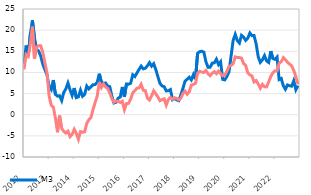
| Category | M3  | Domestic loans to the non-monetary sector |
|---|---|---|
| 2012-01-01 | 12.01 | 10.729 |
| 2012-02-01 | 16.354 | 14.221 |
| 2012-03-01 | 13.992 | 13.782 |
| 2012-04-01 | 18.952 | 16.69 |
| 2012-05-01 | 22.329 | 20.823 |
| 2012-06-01 | 18.134 | 13.296 |
| 2012-07-01 | 15.507 | 16.043 |
| 2012-08-01 | 15.015 | 16.313 |
| 2012-09-01 | 13.837 | 16.292 |
| 2012-10-01 | 11.912 | 14.641 |
| 2012-11-01 | 10.629 | 12.241 |
| 2012-12-01 | 9.421 | 9.834 |
| 2013-01-01 | 6.554 | 4.448 |
| 2013-02-01 | 5.916 | 2.211 |
| 2013-03-01 | 8.196 | 1.791 |
| 2013-04-01 | 4.809 | -0.816 |
| 2013-05-01 | 4.39 | -4.149 |
| 2013-06-01 | 4.482 | -0.203 |
| 2013-07-01 | 3.358 | -3.232 |
| 2013-08-01 | 5.277 | -3.913 |
| 2013-09-01 | 6.108 | -4.338 |
| 2013-10-01 | 7.502 | -3.897 |
| 2013-11-01 | 5.896 | -5.181 |
| 2013-12-01 | 4.573 | -4.65 |
| 2014-01-01 | 6.313 | -3.453 |
| 2014-02-01 | 4.038 | -4.43 |
| 2014-03-01 | 4.234 | -5.804 |
| 2014-04-01 | 5.797 | -3.993 |
| 2014-05-01 | 4.358 | -4.149 |
| 2014-06-01 | 4.845 | -4.035 |
| 2014-07-01 | 6.767 | -2.016 |
| 2014-08-01 | 6.108 | -1.198 |
| 2014-09-01 | 6.605 | -0.64 |
| 2014-10-01 | 7.075 | 1.254 |
| 2014-11-01 | 7.143 | 2.875 |
| 2014-12-01 | 7.648 | 4.423 |
| 2015-01-01 | 9.694 | 7.684 |
| 2015-02-01 | 7.639 | 6.418 |
| 2015-03-01 | 7.404 | 7.278 |
| 2015-04-01 | 7.508 | 6.557 |
| 2015-05-01 | 6.749 | 6.196 |
| 2015-06-01 | 6.629 | 5.14 |
| 2015-07-01 | 4.381 | 3.777 |
| 2015-08-01 | 2.769 | 2.956 |
| 2015-09-01 | 2.936 | 3.226 |
| 2015-10-01 | 3.902 | 3.199 |
| 2015-11-01 | 4.175 | 2.893 |
| 2015-12-01 | 6.564 | 3.196 |
| 2016-01-01 | 4.278 | 1.199 |
| 2016-02-01 | 7.267 | 2.638 |
| 2016-03-01 | 7.218 | 2.687 |
| 2016-04-01 | 7.458 | 3.711 |
| 2016-05-01 | 9.45 | 5.171 |
| 2016-06-01 | 9.03 | 5.69 |
| 2016-07-01 | 9.881 | 6.257 |
| 2016-08-01 | 10.715 | 6.355 |
| 2016-09-01 | 11.496 | 7.196 |
| 2016-10-01 | 10.853 | 5.785 |
| 2016-11-01 | 11.002 | 5.691 |
| 2016-12-01 | 11.553 | 3.906 |
| 2017-01-01 | 12.319 | 3.475 |
| 2017-02-01 | 11.489 | 4.47 |
| 2017-03-01 | 12.067 | 5.654 |
| 2017-04-01 | 10.696 | 4.923 |
| 2017-05-01 | 9.013 | 4.221 |
| 2017-06-01 | 7.423 | 3.312 |
| 2017-07-01 | 6.807 | 3.565 |
| 2017-08-01 | 6.642 | 3.755 |
| 2017-09-01 | 5.632 | 2.278 |
| 2017-10-01 | 5.691 | 3.574 |
| 2017-11-01 | 5.952 | 4.092 |
| 2017-12-01 | 3.567 | 3.671 |
| 2018-01-01 | 3.888 | 3.977 |
| 2018-02-01 | 3.511 | 3.859 |
| 2018-03-01 | 3.318 | 3.502 |
| 2018-04-01 | 4.689 | 3.934 |
| 2018-05-01 | 6.249 | 5.016 |
| 2018-06-01 | 7.929 | 5.586 |
| 2018-07-01 | 8.383 | 4.847 |
| 2018-08-01 | 8.861 | 5.412 |
| 2018-09-01 | 8.24 | 7.016 |
| 2018-10-31 | 9.483 | 7.163 |
| 2018-11-30 | 8.409 | 7.417 |
| 2018-12-31 | 14.522 | 9.795 |
| 2019-01-31 | 14.909 | 10.252 |
| 2019-02-28 | 15.018 | 10.086 |
| 2019-03-31 | 14.797 | 9.982 |
| 2019-04-30 | 12.506 | 10.464 |
| 2019-05-31 | 11.216 | 9.694 |
| 2019-06-30 | 11.23 | 9.224 |
| 2019-07-31 | 12.186 | 9.826 |
| 2019-08-31 | 12.279 | 10.177 |
| 2019-09-30 | 13.127 | 9.697 |
| 2019-10-31 | 11.864 | 10.311 |
| 2019-11-30 | 12.513 | 9.755 |
| 2019-12-31 | 8.354 | 9.245 |
| 2020-01-31 | 8.237 | 9.334 |
| 2020-02-29 | 9.035 | 10.229 |
| 2020-03-31 | 10.113 | 11.424 |
| 2020-04-30 | 13.811 | 11.641 |
| 2020-05-31 | 17.557 | 12.071 |
| 2020-06-30 | 18.995 | 13.679 |
| 2020-07-31 | 17.552 | 13.526 |
| 2020-08-31 | 16.965 | 13.505 |
| 2020-09-30 | 18.779 | 13.379 |
| 2020-10-31 | 18.356 | 12.108 |
| 2020-11-30 | 17.578 | 11.663 |
| 2020-12-31 | 18.105 | 9.901 |
| 2021-01-31 | 19.323 | 9.428 |
| 2021-02-28 | 18.702 | 9.17 |
| 2021-03-31 | 18.724 | 7.735 |
| 2021-04-30 | 16.749 | 8.079 |
| 2021-05-31 | 13.689 | 7.279 |
| 2021-06-30 | 12.386 | 6.275 |
| 2021-07-31 | 12.98 | 7.175 |
| 2021-08-31 | 13.971 | 6.618 |
| 2021-09-30 | 12.717 | 6.585 |
| 2021-10-31 | 12.354 | 7.764 |
| 2021-11-30 | 15.024 | 9.049 |
| 2021-12-31 | 13.293 | 9.904 |
| 2022-01-31 | 13.088 | 10.364 |
| 2022-02-28 | 13.628 | 10.35 |
| 2022-03-31 | 8.323 | 12.2 |
| 2022-04-30 | 8.576 | 12.527 |
| 2022-05-31 | 6.855 | 13.492 |
| 2022-06-30 | 6.013 | 12.99 |
| 2022-07-31 | 7.048 | 12.403 |
| 2022-08-31 | 6.841 | 11.963 |
| 2022-09-30 | 6.755 | 11.535 |
| 2022-10-31 | 8.03 | 10.466 |
| 2022-11-30 | 5.915 | 8.996 |
| 2022-12-31 | 6.863 | 7.19 |